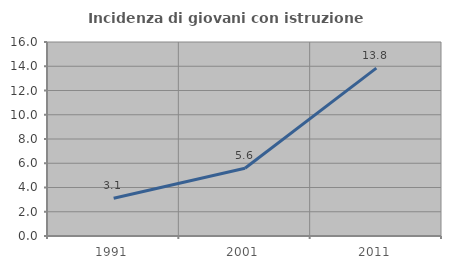
| Category | Incidenza di giovani con istruzione universitaria |
|---|---|
| 1991.0 | 3.115 |
| 2001.0 | 5.59 |
| 2011.0 | 13.846 |